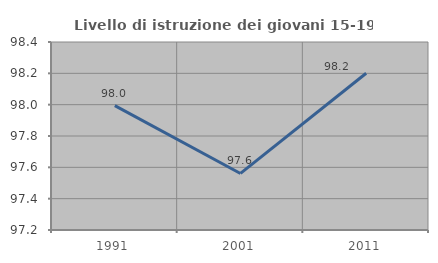
| Category | Livello di istruzione dei giovani 15-19 anni |
|---|---|
| 1991.0 | 97.994 |
| 2001.0 | 97.561 |
| 2011.0 | 98.201 |